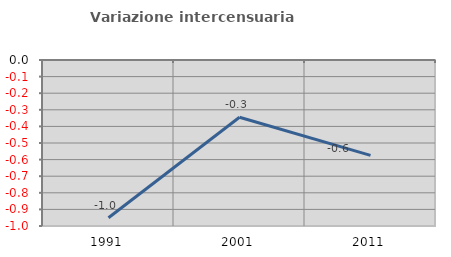
| Category | Variazione intercensuaria annua |
|---|---|
| 1991.0 | -0.95 |
| 2001.0 | -0.345 |
| 2011.0 | -0.575 |